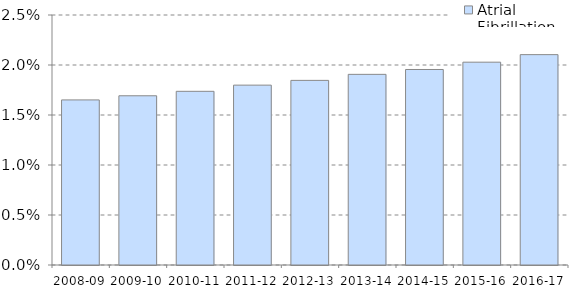
| Category | Atrial Fibrillation |
|---|---|
| 2008-09 | 0.017 |
| 2009-10 | 0.017 |
| 2010-11 | 0.017 |
| 2011-12 | 0.018 |
| 2012-13 | 0.018 |
| 2013-14 | 0.019 |
| 2014-15 | 0.02 |
| 2015-16 | 0.02 |
| 2016-17 | 0.021 |